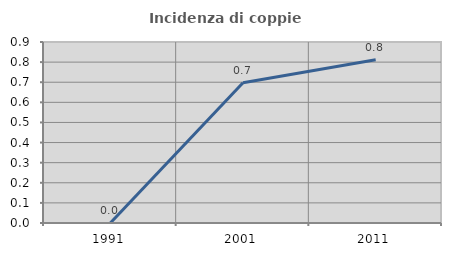
| Category | Incidenza di coppie miste |
|---|---|
| 1991.0 | 0 |
| 2001.0 | 0.698 |
| 2011.0 | 0.811 |